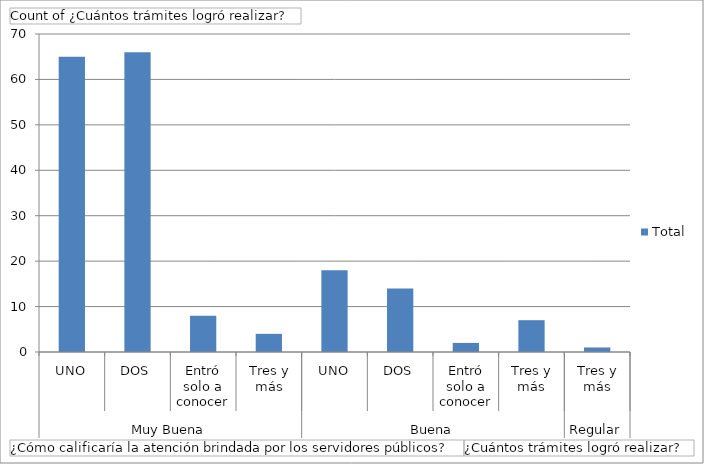
| Category | Total |
|---|---|
| 0 | 65 |
| 1 | 66 |
| 2 | 8 |
| 3 | 4 |
| 4 | 18 |
| 5 | 14 |
| 6 | 2 |
| 7 | 7 |
| 8 | 1 |